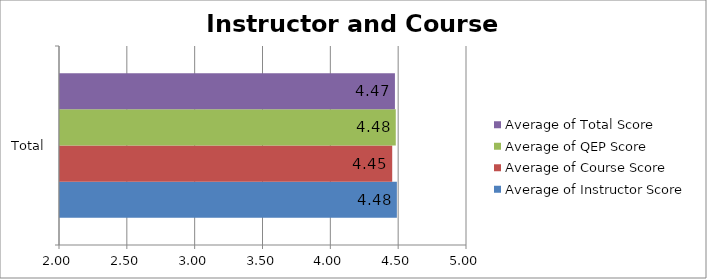
| Category | Average of Instructor Score | Average of Course Score | Average of QEP Score | Average of Total Score |
|---|---|---|---|---|
| Total | 4.483 | 4.449 | 4.475 | 4.469 |